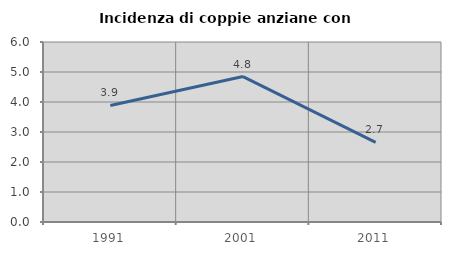
| Category | Incidenza di coppie anziane con figli |
|---|---|
| 1991.0 | 3.883 |
| 2001.0 | 4.848 |
| 2011.0 | 2.655 |